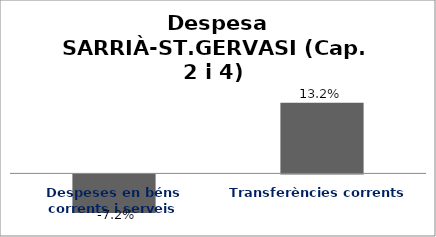
| Category | Series 0 |
|---|---|
| Despeses en béns corrents i serveis | -0.072 |
| Transferències corrents | 0.132 |